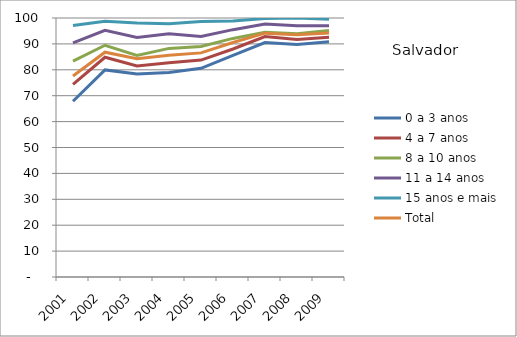
| Category | 0 a 3 anos | 4 a 7 anos | 8 a 10 anos | 11 a 14 anos | 15 anos e mais | Total |
|---|---|---|---|---|---|---|
| 2001.0 | 67.84 | 74.35 | 83.34 | 90.36 | 97.12 | 77.62 |
| 2002.0 | 79.95 | 84.85 | 89.48 | 95.23 | 98.78 | 86.79 |
| 2003.0 | 78.41 | 81.48 | 85.52 | 92.45 | 98.05 | 84.25 |
| 2004.0 | 78.92 | 82.68 | 88.27 | 93.91 | 97.76 | 85.61 |
| 2005.0 | 80.57 | 83.75 | 88.99 | 92.89 | 98.61 | 86.53 |
| 2006.0 | 85.53 | 88.03 | 92.12 | 95.5 | 98.86 | 90.56 |
| 2007.0 | 90.5 | 92.86 | 94.53 | 97.72 | 99.78 | 94.14 |
| 2008.0 | 89.81 | 91.66 | 93.9 | 96.98 | 100 | 93.56 |
| 2009.0 | 90.84 | 92.55 | 95.14 | 97.01 | 99.52 | 94.2 |